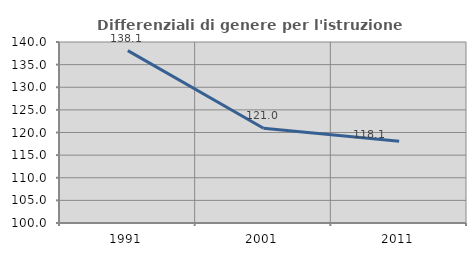
| Category | Differenziali di genere per l'istruzione superiore |
|---|---|
| 1991.0 | 138.09 |
| 2001.0 | 120.954 |
| 2011.0 | 118.075 |